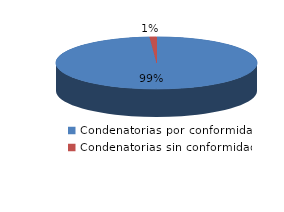
| Category | Series 0 |
|---|---|
| 0 | 444 |
| 1 | 5 |